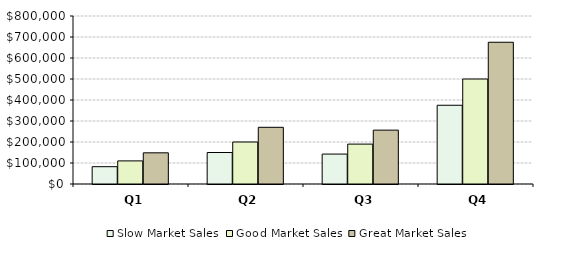
| Category | Slow Market Sales | Good Market Sales | Great Market Sales |
|---|---|---|---|
| Q1 | 82500 | 110000 | 148500 |
| Q2 | 150000 | 200000 | 270000 |
| Q3 | 142500 | 190000 | 256500 |
| Q4 | 375000 | 500000 | 675000 |